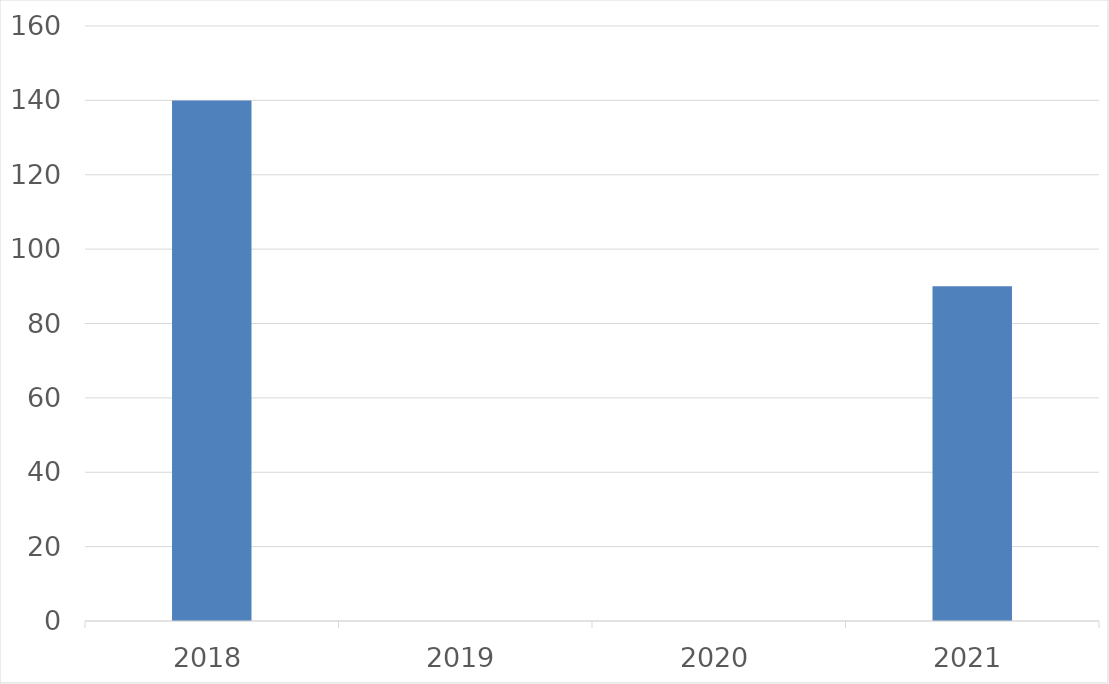
| Category | Series 0 |
|---|---|
| 2018 | 140 |
| 2019 | 0 |
| 2020 | 0 |
| 2021 | 90 |